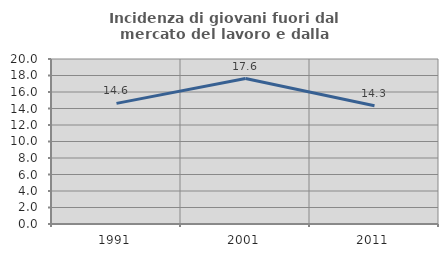
| Category | Incidenza di giovani fuori dal mercato del lavoro e dalla formazione  |
|---|---|
| 1991.0 | 14.621 |
| 2001.0 | 17.635 |
| 2011.0 | 14.339 |